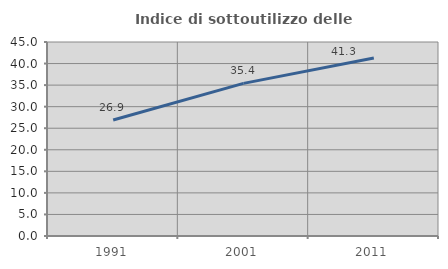
| Category | Indice di sottoutilizzo delle abitazioni  |
|---|---|
| 1991.0 | 26.92 |
| 2001.0 | 35.405 |
| 2011.0 | 41.286 |